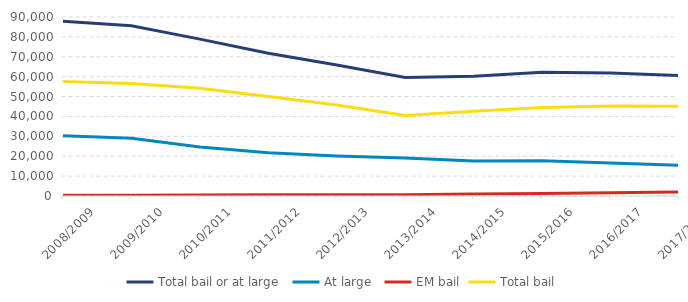
| Category | Total bail or at large | At large | EM bail | Total bail |
|---|---|---|---|---|
| 2008/2009 | 87804 | 30289 | 316 | 57515 |
| 2009/2010 | 85626 | 29075 | 394 | 56551 |
| 2010/2011 | 78874 | 24684 | 498 | 54190 |
| 2011/2012 | 71733 | 21713 | 599 | 50020 |
| 2012/2013 | 65861 | 20062 | 606 | 45799 |
| 2013/2014 | 59576 | 19142 | 684 | 40434 |
| 2014/2015 | 60244 | 17656 | 1017 | 42588 |
| 2015/2016 | 62230 | 17762 | 1268 | 44468 |
| 2016/2017 | 61877 | 16608 | 1581 | 45269 |
| 2017/2018 | 60522 | 15400 | 2032 | 45122 |